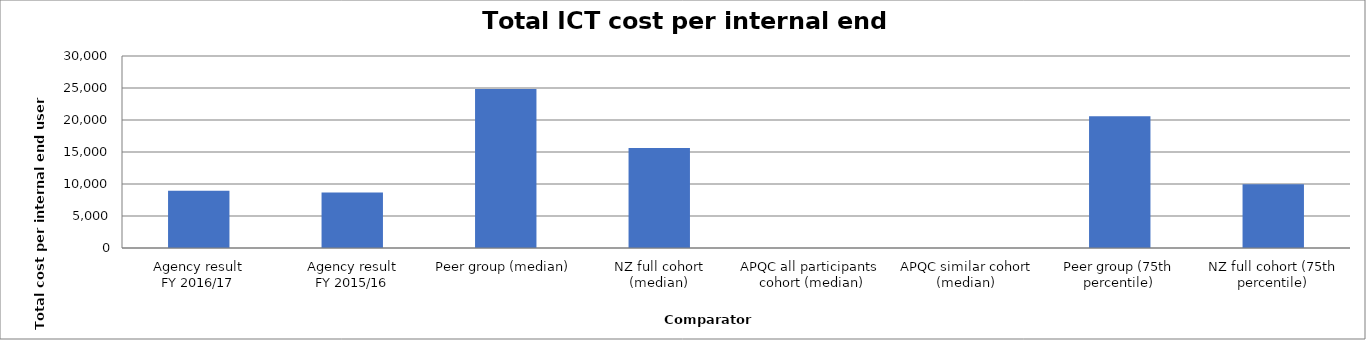
| Category | Result |
|---|---|
| Agency result
FY 2016/17 | 8941.105 |
| Agency result
FY 2015/16 | 8682.058 |
| Peer group (median) | 24844.043 |
| NZ full cohort (median) | 15628.914 |
| APQC all participants 
cohort (median) | 0 |
| APQC similar cohort (median) | 0 |
| Peer group (75th percentile) | 20597.177 |
| NZ full cohort (75th percentile) | 9979.257 |